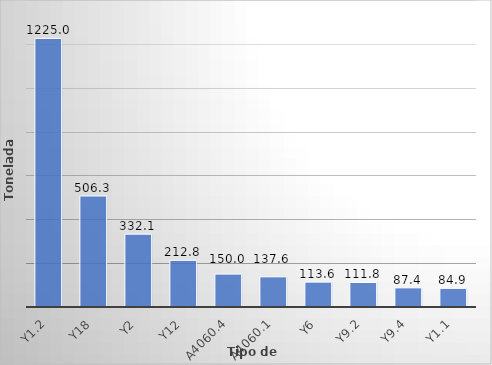
| Category | Series 0 |
|---|---|
| Y1.2 | 1224.957 |
| Y18 | 506.304 |
| Y2 | 332.131 |
| Y12 | 212.835 |
| A4060.4 | 149.992 |
| A4060.1 | 137.588 |
| Y6 | 113.556 |
| Y9.2 | 111.768 |
| Y9.4 | 87.35 |
| Y1.1 | 84.949 |